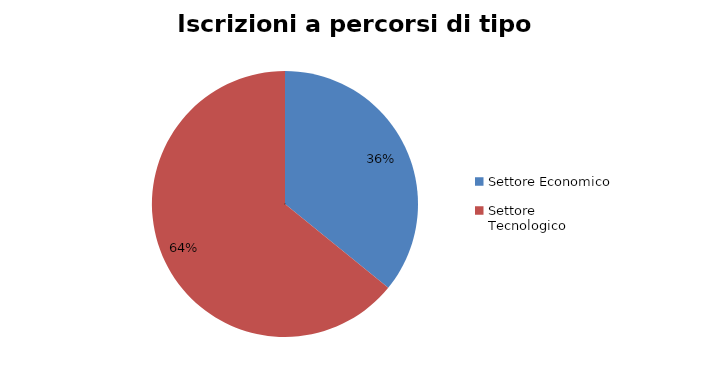
| Category | Series 0 |
|---|---|
| Settore Economico | 4705 |
| Settore Tecnologico | 8416 |